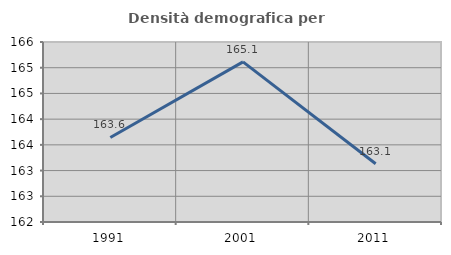
| Category | Densità demografica |
|---|---|
| 1991.0 | 163.644 |
| 2001.0 | 165.114 |
| 2011.0 | 163.132 |